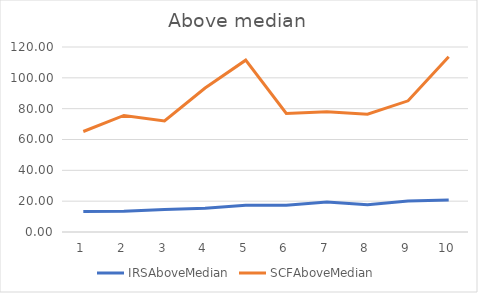
| Category | IRSAboveMedian | SCFAboveMedian |
|---|---|---|
| 0 | 13.249 | 65.181 |
| 1 | 13.521 | 75.608 |
| 2 | 14.664 | 72.08 |
| 3 | 15.485 | 93.426 |
| 4 | 17.323 | 111.468 |
| 5 | 17.317 | 76.854 |
| 6 | 19.409 | 78.026 |
| 7 | 17.611 | 76.459 |
| 8 | 20.177 | 85.093 |
| 9 | 20.754 | 113.691 |